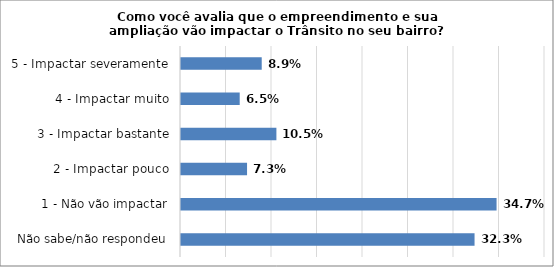
| Category | Series 0 |
|---|---|
| Não sabe/não respondeu | 0.323 |
| 1 - Não vão impactar | 0.347 |
| 2 - Impactar pouco | 0.073 |
| 3 - Impactar bastante | 0.105 |
| 4 - Impactar muito | 0.065 |
| 5 - Impactar severamente | 0.089 |